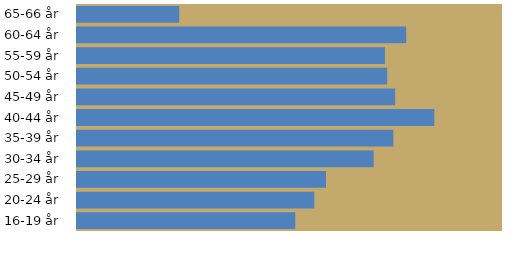
| Category | Etnisk danske |
|---|---|
| 16-19 år | 0.072 |
| 20-24 år | 0.078 |
| 25-29 år | 0.082 |
| 30-34 år | 0.097 |
| 35-39 år | 0.104 |
| 40-44 år | 0.117 |
| 45-49 år | 0.105 |
| 50-54 år | 0.102 |
| 55-59 år | 0.101 |
| 60-64 år | 0.108 |
| 65-66 år | 0.034 |